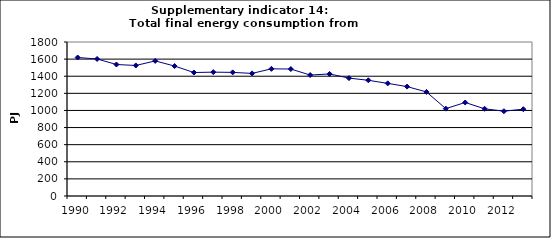
| Category | Total final energy consumption from industry, PJ |
|---|---|
| 1990 | 1618.6 |
| 1991 | 1601.732 |
| 1992 | 1536.999 |
| 1993 | 1525.662 |
| 1994 | 1578.897 |
| 1995 | 1518.823 |
| 1996 | 1443.198 |
| 1997 | 1447.69 |
| 1998 | 1444.955 |
| 1999 | 1432.801 |
| 2000 | 1486.572 |
| 2001 | 1483.912 |
| 2002 | 1413.626 |
| 2003 | 1426.618 |
| 2004 | 1377.978 |
| 2005 | 1352.47 |
| 2006 | 1316.422 |
| 2007 | 1278.661 |
| 2008 | 1216.379 |
| 2009 | 1021.104 |
| 2010 | 1093.126 |
| 2011 | 1019.221 |
| 2012 | 991.187 |
| 2013 | 1014.521 |